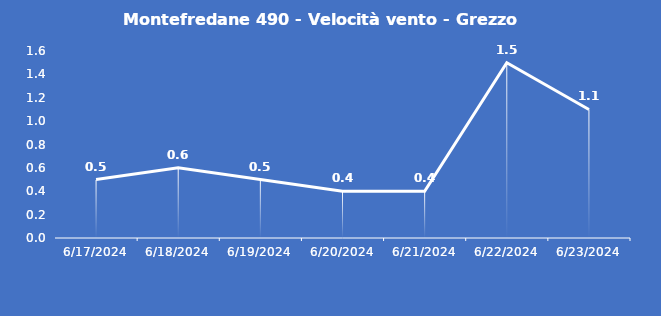
| Category | Montefredane 490 - Velocità vento - Grezzo (m/s) |
|---|---|
| 6/17/24 | 0.5 |
| 6/18/24 | 0.6 |
| 6/19/24 | 0.5 |
| 6/20/24 | 0.4 |
| 6/21/24 | 0.4 |
| 6/22/24 | 1.5 |
| 6/23/24 | 1.1 |